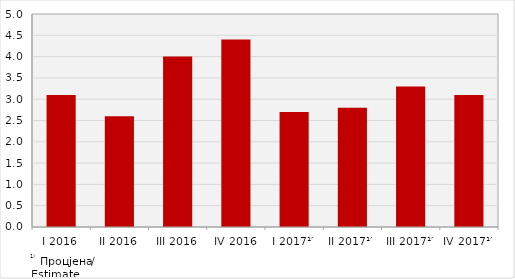
| Category | Стопе реалног раста БДП-а
Real growth rates of GDP |
|---|---|
| I 2016 | 3.1 |
| II 2016 | 2.6 |
| III 2016 | 4 |
| IV 2016 | 4.4 |
| I 2017¹′ | 2.7 |
| II 2017¹′ | 2.8 |
| III 2017¹′ | 3.3 |
| IV 2017¹′ | 3.1 |